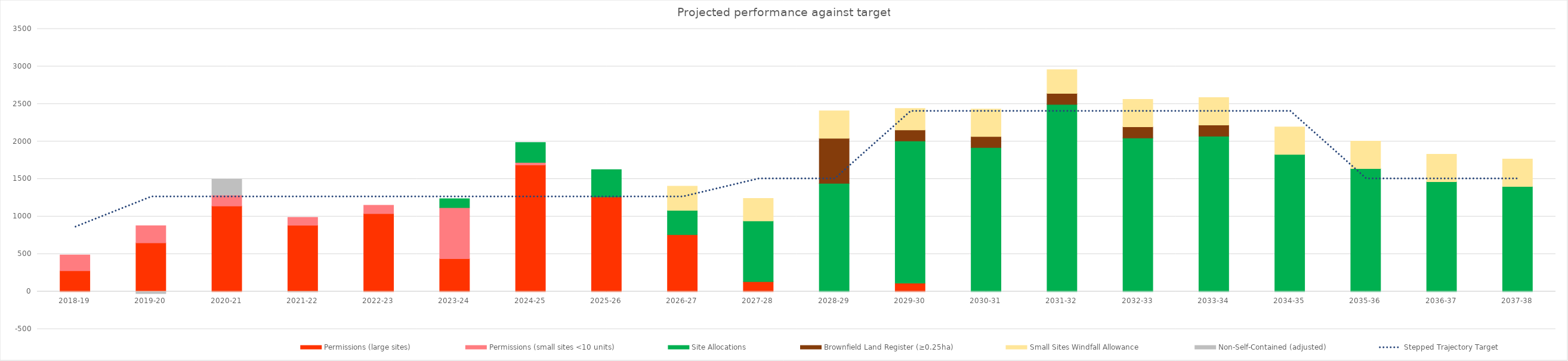
| Category | Permissions (large sites) | Permissions (small sites <10 units) | Site Allocations | Brownfield Land Register (≥0.25ha) | Small Sites Windfall Allowance  | Non-Self-Contained (adjusted) |
|---|---|---|---|---|---|---|
| 2018-19 | 277 | 211 | 0 | 0 | 0 | 0 |
| 2019-20 | 650 | 228 | 0 | 0 | 0 | -27 |
| 2020-21 | 1140 | 145 | 0 | 0 | 0 | 213 |
| 2021-22 | 883 | 106 | 0 | 0 | 0 | -2 |
| 2022-23 | 1039 | 112 | 0 | 0 | 0 | 0 |
| 2023-24 | 438 | 680 | 120 | 0 | 0 | 0 |
| 2024-25 | 1686 | 35 | 266 | 0 | 0 | 0 |
| 2025-26 | 1261 | 0 | 365 | 0 | 0 | 0 |
| 2026-27 | 758 | 0 | 324 | 0 | 322.6 | 0 |
| 2027-28 | 132 | 0 | 809 | 0 | 300.6 | 0 |
| 2028-29 | 0 | 0 | 1442 | 600.063 | 365.6 | 0 |
| 2029-30 | 112 | 0 | 1894 | 148.088 | 286.6 | 0 |
| 2030-31 | 0 | 0 | 1919 | 148.088 | 365.6 | 0 |
| 2031-32 | 0 | 0 | 2494 | 148.088 | 314.6 | 0 |
| 2032-33 | 0 | 0 | 2047 | 148.088 | 365.6 | 0 |
| 2033-34 | 0 | 0 | 2071 | 148.088 | 365.6 | 0 |
| 2034-35 | 0 | 0 | 1828 | 0 | 365.6 | 0 |
| 2035-36 | 0 | 0 | 1640 | 0 | 365.6 | 0 |
| 2036-37 | 0 | 0 | 1465 | 0 | 365.6 | 0 |
| 2037-38 | 0 | 0 | 1400 | 0 | 366 | 0 |